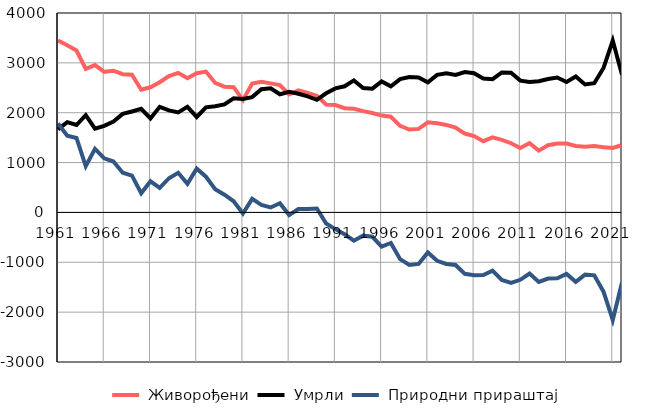
| Category |  Живорођени |  Умрли |  Природни прираштај |
|---|---|---|---|
| 1961.0 | 3450 | 1667 | 1783 |
| 1962.0 | 3351 | 1811 | 1540 |
| 1963.0 | 3247 | 1753 | 1494 |
| 1964.0 | 2880 | 1951 | 929 |
| 1965.0 | 2956 | 1679 | 1277 |
| 1966.0 | 2820 | 1735 | 1085 |
| 1967.0 | 2842 | 1822 | 1020 |
| 1968.0 | 2772 | 1976 | 796 |
| 1969.0 | 2761 | 2024 | 737 |
| 1970.0 | 2461 | 2077 | 384 |
| 1971.0 | 2510 | 1885 | 625 |
| 1972.0 | 2612 | 2119 | 493 |
| 1973.0 | 2733 | 2047 | 686 |
| 1974.0 | 2800 | 2005 | 795 |
| 1975.0 | 2691 | 2117 | 574 |
| 1976.0 | 2793 | 1915 | 878 |
| 1977.0 | 2825 | 2109 | 716 |
| 1978.0 | 2597 | 2131 | 466 |
| 1979.0 | 2522 | 2166 | 356 |
| 1980.0 | 2513 | 2290 | 223 |
| 1981.0 | 2253 | 2274 | -21 |
| 1982.0 | 2585 | 2313 | 272 |
| 1983.0 | 2622 | 2470 | 152 |
| 1984.0 | 2589 | 2490 | 99 |
| 1985.0 | 2554 | 2370 | 184 |
| 1986.0 | 2369 | 2421 | -52 |
| 1987.0 | 2448 | 2380 | 68 |
| 1988.0 | 2399 | 2329 | 70 |
| 1989.0 | 2339 | 2259 | 80 |
| 1990.0 | 2166 | 2389 | -223 |
| 1991.0 | 2153 | 2488 | -335 |
| 1992.0 | 2091 | 2530 | -439 |
| 1993.0 | 2080 | 2648 | -568 |
| 1994.0 | 2031 | 2497 | -466 |
| 1995.0 | 1995 | 2483 | -488 |
| 1996.0 | 1942 | 2628 | -686 |
| 1997.0 | 1919 | 2530 | -611 |
| 1998.0 | 1736 | 2673 | -937 |
| 1999.0 | 1662 | 2716 | -1054 |
| 2000.0 | 1675 | 2708 | -1033 |
| 2001.0 | 1808 | 2610 | -802 |
| 2002.0 | 1788 | 2759 | -971 |
| 2003.0 | 1755 | 2789 | -1034 |
| 2004.0 | 1704 | 2758 | -1054 |
| 2005.0 | 1582 | 2814 | -1232 |
| 2006.0 | 1533 | 2793 | -1260 |
| 2007.0 | 1429 | 2686 | -1257 |
| 2008.0 | 1505 | 2672 | -1167 |
| 2009.0 | 1455 | 2808 | -1353 |
| 2010.0 | 1388 | 2803 | -1415 |
| 2011.0 | 1293 | 2644 | -1351 |
| 2012.0 | 1391 | 2617 | -1226 |
| 2013.0 | 1240 | 2633 | -1393 |
| 2014.0 | 1349 | 2676 | -1327 |
| 2015.0 | 1383 | 2705 | -1322 |
| 2016.0 | 1381 | 2615 | -1234 |
| 2017.0 | 1334 | 2726 | -1392 |
| 2018.0 | 1319 | 2566 | -1247 |
| 2019.0 | 1330 | 2592 | -1262 |
| 2020.0 | 1309 | 2898 | -1589 |
| 2021.0 | 1292 | 3448 | -2156 |
| 2022.0 | 1353 | 2760 | -1407 |